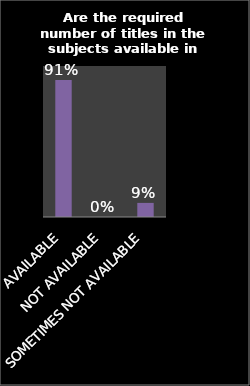
| Category | Series 0 |
|---|---|
| AVAILABLE | 0.907 |
| NOT AVAILABLE | 0 |
| SOMETIMES NOT AVAILABLE | 0.093 |